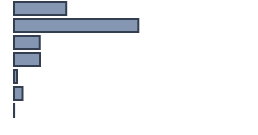
| Category | Percentatge |
|---|---|
| 0 | 21.756 |
| 1 | 51.792 |
| 2 | 10.696 |
| 3 | 10.832 |
| 4 | 1.3 |
| 5 | 3.584 |
| 6 | 0.041 |